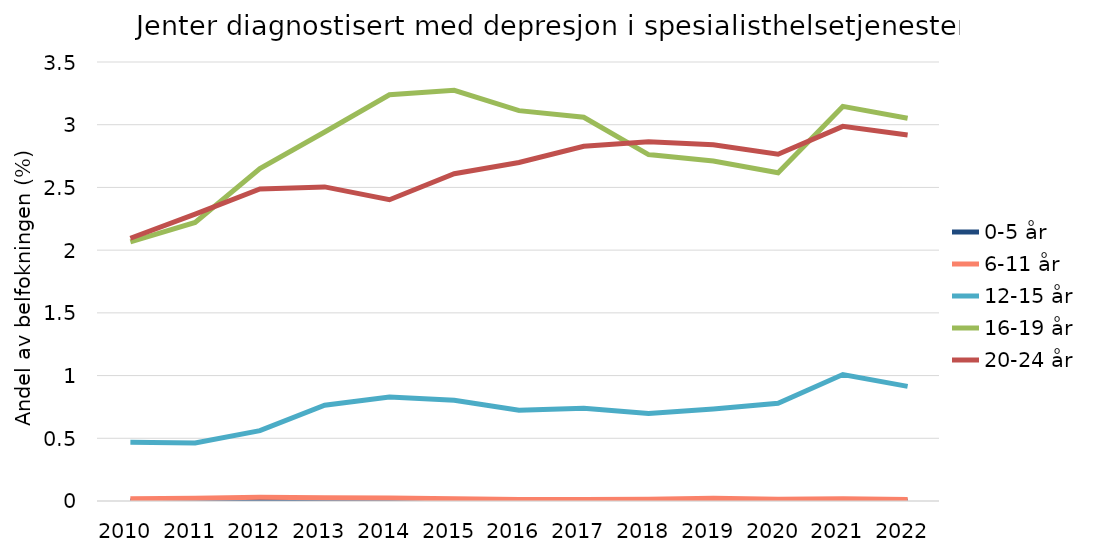
| Category | 0-5 år | 6-11 år | 12-15 år | 16-19 år | 20-24 år |
|---|---|---|---|---|---|
| 2010.0 | 0.001 | 0.018 | 0.468 | 2.067 | 2.095 |
| 2011.0 | 0.001 | 0.023 | 0.463 | 2.221 | 2.288 |
| 2012.0 | 0.001 | 0.03 | 0.561 | 2.65 | 2.488 |
| 2013.0 | 0.001 | 0.026 | 0.764 | 2.942 | 2.504 |
| 2014.0 | 0 | 0.024 | 0.829 | 3.239 | 2.402 |
| 2015.0 | 0 | 0.017 | 0.802 | 3.275 | 2.61 |
| 2016.0 | 0 | 0.012 | 0.723 | 3.112 | 2.699 |
| 2017.0 | 0.001 | 0.012 | 0.74 | 3.059 | 2.828 |
| 2018.0 | 0 | 0.014 | 0.698 | 2.762 | 2.864 |
| 2019.0 | 0.001 | 0.022 | 0.733 | 2.71 | 2.839 |
| 2020.0 | 0.001 | 0.015 | 0.779 | 2.617 | 2.765 |
| 2021.0 | 0 | 0.018 | 1.008 | 3.146 | 2.987 |
| 2022.0 | 0.001 | 0.011 | 0.914 | 3.052 | 2.918 |